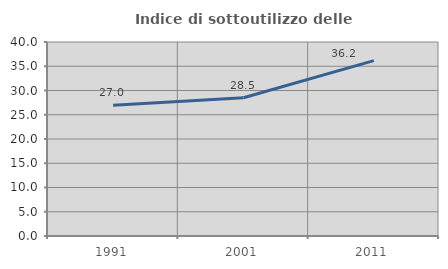
| Category | Indice di sottoutilizzo delle abitazioni  |
|---|---|
| 1991.0 | 26.968 |
| 2001.0 | 28.507 |
| 2011.0 | 36.17 |